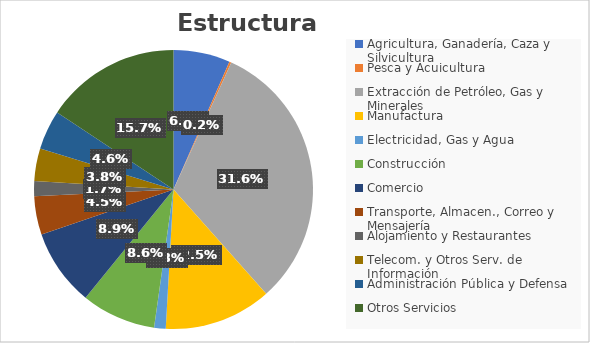
| Category | Series 0 |
|---|---|
| Agricultura, Ganadería, Caza y Silvicultura | 5235023 |
| Pesca y Acuicultura | 188193 |
| Extracción de Petróleo, Gas y Minerales | 25212547 |
| Manufactura | 9922751 |
| Electricidad, Gas y Agua | 1070649 |
| Construcción | 6877098 |
| Comercio | 7094539 |
| Transporte, Almacen., Correo y Mensajería | 3560869 |
| Alojamiento y Restaurantes | 1393249 |
| Telecom. y Otros Serv. de Información | 3002279 |
| Administración Pública y Defensa | 3635333 |
| Otros Servicios | 12511722 |